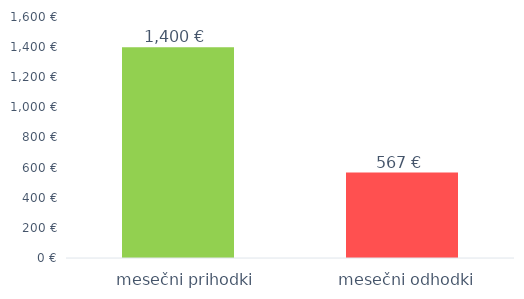
| Category | Series 0 |
|---|---|
|     mesečni prihodki | 1400 |
|    mesečni odhodki | 567 |